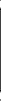
| Category | Series 0 |
|---|---|
| 2h.1 | 1.05 |
| 2h.2 | 0.96 |
| 6h.1 | 1.24 |
| 6h.2 | 1.55 |
| 30h.1 | 1.74 |
| 30h.2 | 2.11 |